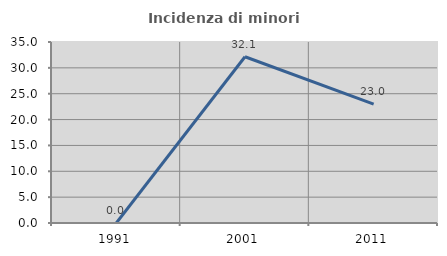
| Category | Incidenza di minori stranieri |
|---|---|
| 1991.0 | 0 |
| 2001.0 | 32.143 |
| 2011.0 | 22.973 |